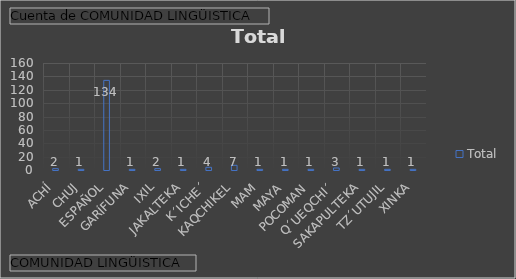
| Category | Total |
|---|---|
| ACHÍ | 2 |
| CHUJ | 1 |
| ESPAÑOL | 134 |
| GARÍFUNA | 1 |
| IXIL | 2 |
| JAKALTEKA | 1 |
| K´ICHE´ | 4 |
| KAQCHIKEL | 7 |
| MAM | 1 |
| MAYA | 1 |
| POCOMAN | 1 |
| Q´UEQCHI´ | 3 |
| SAKAPULTEKA | 1 |
| TZ´UTUJIL | 1 |
| XINKA | 1 |